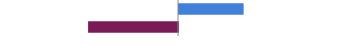
| Category | Series 0 |
|---|---|
| Favorable | 0.365 |
| Unfavorable | -0.508 |